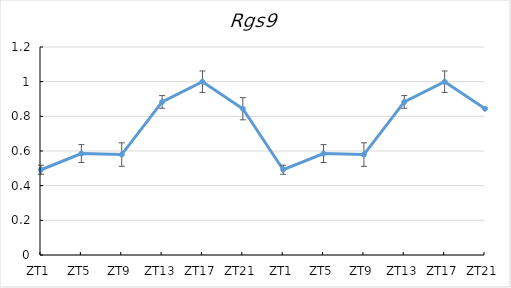
| Category | Series 0 |
|---|---|
| ZT1 | 0.492 |
| ZT5 | 0.585 |
| ZT9 | 0.579 |
| ZT13 | 0.883 |
| ZT17 | 1 |
| ZT21 | 0.844 |
| ZT1 | 0.492 |
| ZT5 | 0.585 |
| ZT9 | 0.579 |
| ZT13 | 0.883 |
| ZT17 | 1 |
| ZT21 | 0.844 |